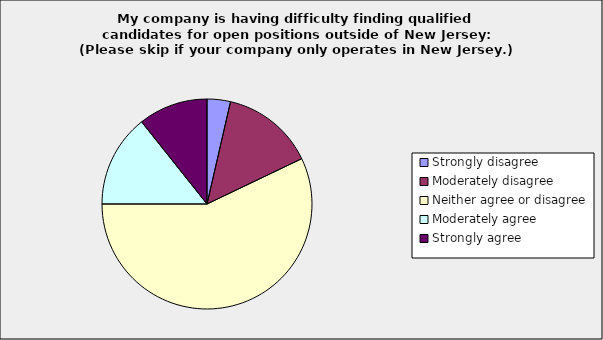
| Category | Series 0 |
|---|---|
| Strongly disagree | 0.036 |
| Moderately disagree | 0.143 |
| Neither agree or disagree | 0.571 |
| Moderately agree | 0.143 |
| Strongly agree | 0.107 |